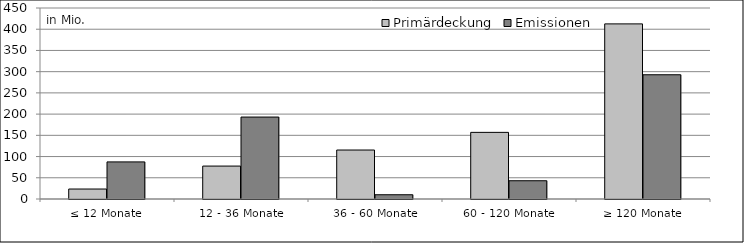
| Category | Primärdeckung | Emissionen |
|---|---|---|
| ≤ 12 Monate | 23501660.85 | 87396850 |
| 12 - 36 Monate | 77574711.54 | 193051192.06 |
| 36 - 60 Monate | 115402362.79 | 10022737.13 |
| 60 - 120 Monate | 156985811.87 | 43000000 |
| ≥ 120 Monate | 412584881.83 | 292733461.86 |